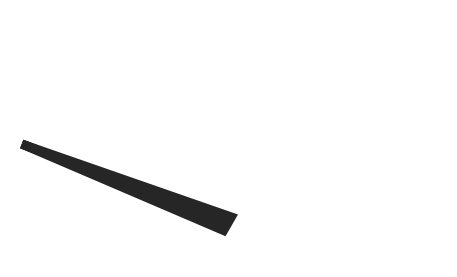
| Category | y |
|---|---|
| 4.793328972321703 | 21.363 |
| 50.85450045719849 | 1.808 |
| 49.14549954280151 | -1.808 |
| 4.793328972321703 | 21.363 |
| 50.0 | 0 |